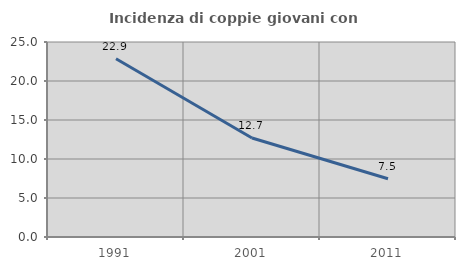
| Category | Incidenza di coppie giovani con figli |
|---|---|
| 1991.0 | 22.863 |
| 2001.0 | 12.692 |
| 2011.0 | 7.471 |